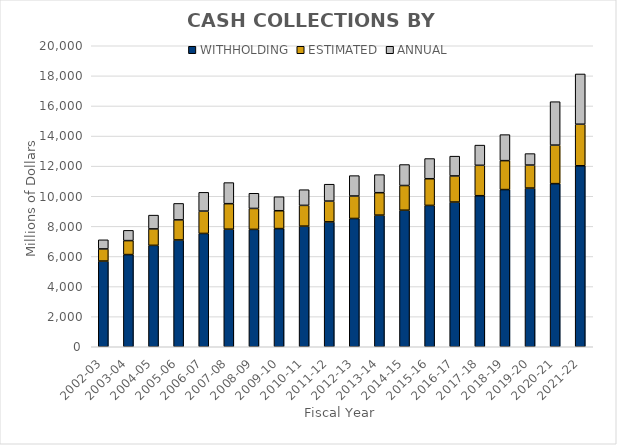
| Category | WITHHOLDING | ESTIMATED | ANNUAL |
|---|---|---|---|
| 2002-03 | 5693.209 | 807.9 | 604.776 |
| 2003-04 | 6124.479 | 928.409 | 680.915 |
| 2004-05 | 6737.636 | 1092.56 | 916.596 |
| 2005-06 | 7094.353 | 1337.061 | 1092.725 |
| 2006-07 | 7528.691 | 1484.783 | 1248.145 |
| 2007-08 | 7810.938 | 1695.939 | 1400.864 |
| 2008-09 | 7798.587 | 1392.148 | 1007.912 |
| 2009-10 | 7851.711 | 1185.958 | 931.064 |
| 2010-11 | 8013.455 | 1380.534 | 1041.717 |
| 2011-12 | 8296.328 | 1381.924 | 1122.275 |
| 2012-13 | 8522.904 | 1493.615 | 1354.727 |
| 2013-14 | 8743.82 | 1493.343 | 1200.141 |
| 2014-15 | 9071.717 | 1641.695 | 1393.964 |
| 2015-16 | 9390.977 | 1773.114 | 1341.873 |
| 2016-17 | 9614.456 | 1735.653 | 1314.264 |
| 2017-18 | 10036.51 | 2019.892 | 1342.553 |
| 2018-19 | 10443.899 | 1922.399 | 1729.224 |
| 2019-20 | 10542.758 | 1528.56 | 763.683 |
| 2020-21 | 10837.978 | 2559.332 | 2886.076 |
| 2021-22 | 12026.246 | 2760.419 | 3339.023 |